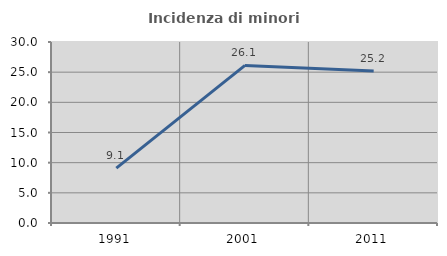
| Category | Incidenza di minori stranieri |
|---|---|
| 1991.0 | 9.091 |
| 2001.0 | 26.119 |
| 2011.0 | 25.192 |